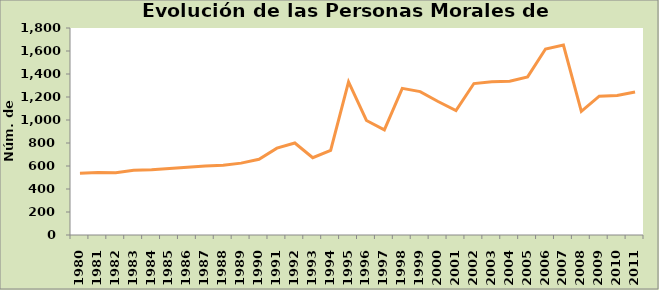
| Category | Series 0 |
|---|---|
| 1980.0 | 537 |
| 1981.0 | 543 |
| 1982.0 | 541 |
| 1983.0 | 563 |
| 1984.0 | 568 |
| 1985.0 | 579 |
| 1986.0 | 589 |
| 1987.0 | 599 |
| 1988.0 | 607 |
| 1989.0 | 625 |
| 1990.0 | 658 |
| 1991.0 | 755 |
| 1992.0 | 800 |
| 1993.0 | 672 |
| 1994.0 | 736 |
| 1995.0 | 1331 |
| 1996.0 | 996 |
| 1997.0 | 914 |
| 1998.0 | 1275 |
| 1999.0 | 1247 |
| 2000.0 | 1161 |
| 2001.0 | 1082 |
| 2002.0 | 1317 |
| 2003.0 | 1333 |
| 2004.0 | 1337 |
| 2005.0 | 1375 |
| 2006.0 | 1617 |
| 2007.0 | 1652 |
| 2008.0 | 1075 |
| 2009.0 | 1207 |
| 2010.0 | 1213 |
| 2011.0 | 1243 |